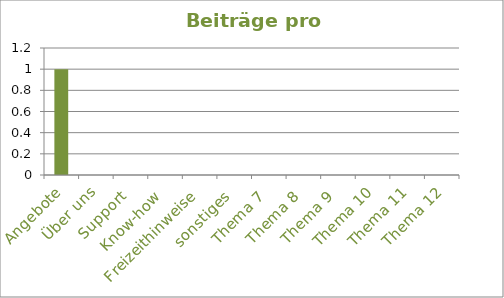
| Category | Beiträge |
|---|---|
| Angebote | 1 |
| Über uns | 0 |
| Support | 0 |
| Know-how | 0 |
| Freizeithinweise | 0 |
| sonstiges | 0 |
| Thema 7 | 0 |
| Thema 8 | 0 |
| Thema 9 | 0 |
| Thema 10 | 0 |
| Thema 11 | 0 |
| Thema 12 | 0 |